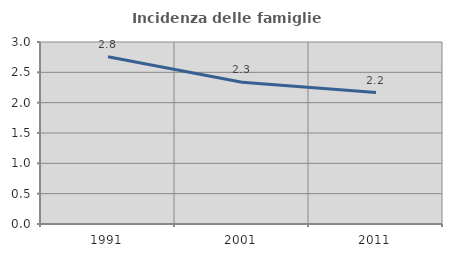
| Category | Incidenza delle famiglie numerose |
|---|---|
| 1991.0 | 2.757 |
| 2001.0 | 2.338 |
| 2011.0 | 2.167 |